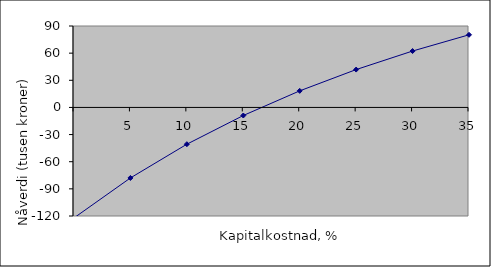
| Category | Series 0 |
|---|---|
|   | -122.119 |
| 5 | -77.94 |
| 10 | -40.661 |
| 15 | -8.925 |
| 20 | 18.307 |
| 25 | 41.846 |
| 30 | 62.331 |
| 35 | 80.269 |